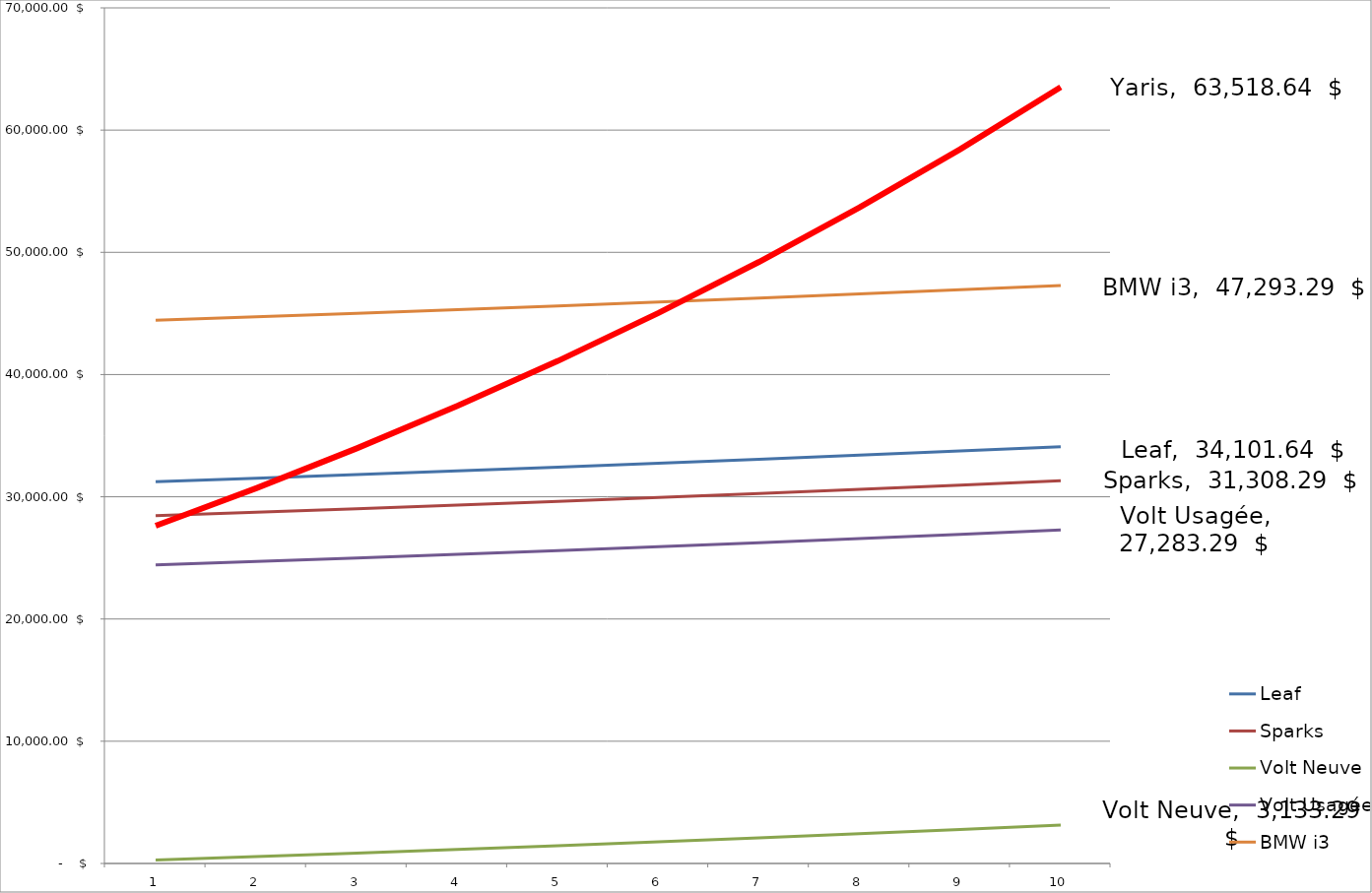
| Category | Leaf | Sparks | Volt Neuve | Volt Usagée | BMW i3 | Yaris |
|---|---|---|---|---|---|---|
| 0 | 31243.35 | 28450 | 275 | 24425 | 44435 | 27625 |
| 1 | 31526.1 | 28732.75 | 557.75 | 24707.75 | 44717.75 | 30700 |
| 2 | 31816.868 | 29023.517 | 848.518 | 24998.517 | 45008.518 | 33963.25 |
| 3 | 32115.931 | 29322.581 | 1147.581 | 25297.581 | 45307.581 | 37429.338 |
| 4 | 32423.58 | 29630.23 | 1455.23 | 25605.23 | 45615.23 | 41114.356 |
| 5 | 32740.118 | 29946.768 | 1771.768 | 25921.768 | 45931.768 | 45036.095 |
| 6 | 33065.857 | 30272.507 | 2097.507 | 26247.507 | 46257.507 | 49214.262 |
| 7 | 33401.127 | 30607.777 | 2432.777 | 26582.777 | 46592.777 | 53670.729 |
| 8 | 33746.268 | 30952.918 | 2777.918 | 26927.918 | 46937.918 | 58429.82 |
| 9 | 34101.636 | 31308.286 | 3133.286 | 27283.286 | 47293.286 | 63518.636 |